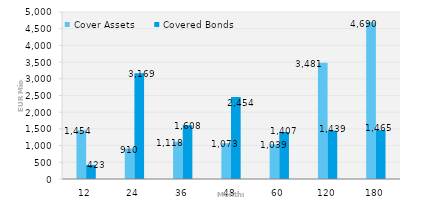
| Category | Cover Assets | Covered Bonds |
|---|---|---|
| 12.0 | 1453.983 | 422.856 |
| 24.0 | 909.8 | 3168.717 |
| 36.0 | 1118.066 | 1607.5 |
| 48.0 | 1073.215 | 2454.293 |
| 60.0 | 1039.194 | 1407.185 |
| 120.0 | 3480.805 | 1438.705 |
| 180.0 | 4690.071 | 1464.657 |